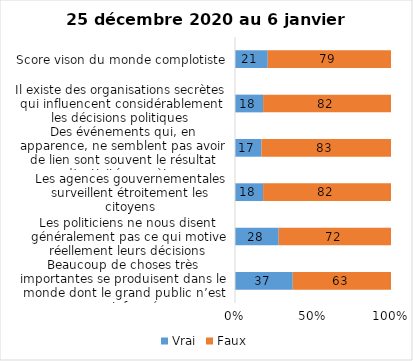
| Category | Vrai | Faux |
|---|---|---|
| Beaucoup de choses très importantes se produisent dans le monde dont le grand public n’est pas informé | 37 | 63 |
| Les politiciens ne nous disent généralement pas ce qui motive réellement leurs décisions | 28 | 72 |
| Les agences gouvernementales surveillent étroitement les citoyens | 18 | 82 |
| Des événements qui, en apparence, ne semblent pas avoir de lien sont souvent le résultat d’activités secrètes | 17 | 83 |
| Il existe des organisations secrètes qui influencent considérablement les décisions politiques | 18 | 82 |
| Score vison du monde complotiste | 21 | 79 |